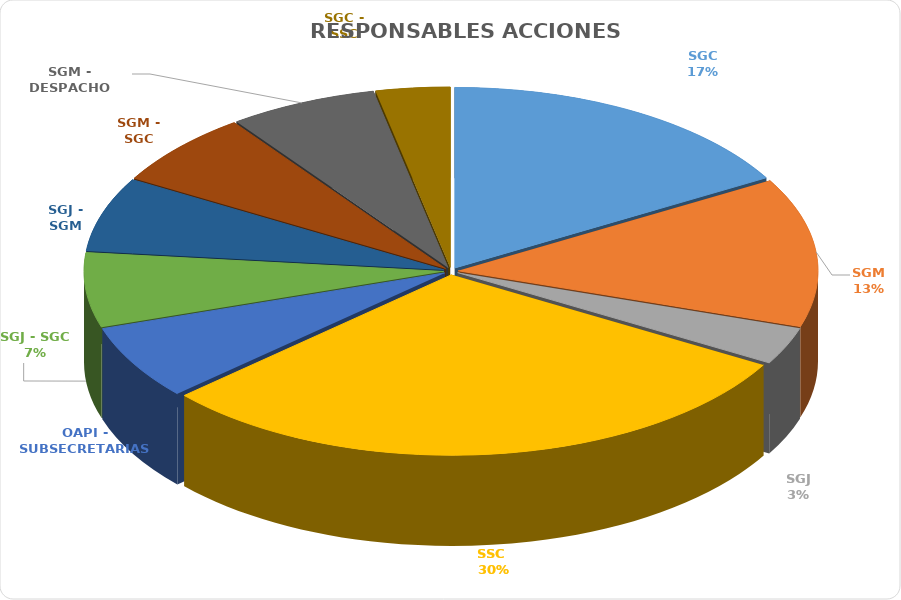
| Category | Series 0 |
|---|---|
| SGC | 5 |
| SGM | 4 |
| SGJ | 1 |
| SSC  | 9 |
| OAPI - SUBSECRETARIAS | 2 |
| SGJ - SGC | 2 |
| SGJ - SGM | 2 |
| SGM - SGC | 2 |
| SGM - DESPACHO | 2 |
| SGC - SSC | 1 |